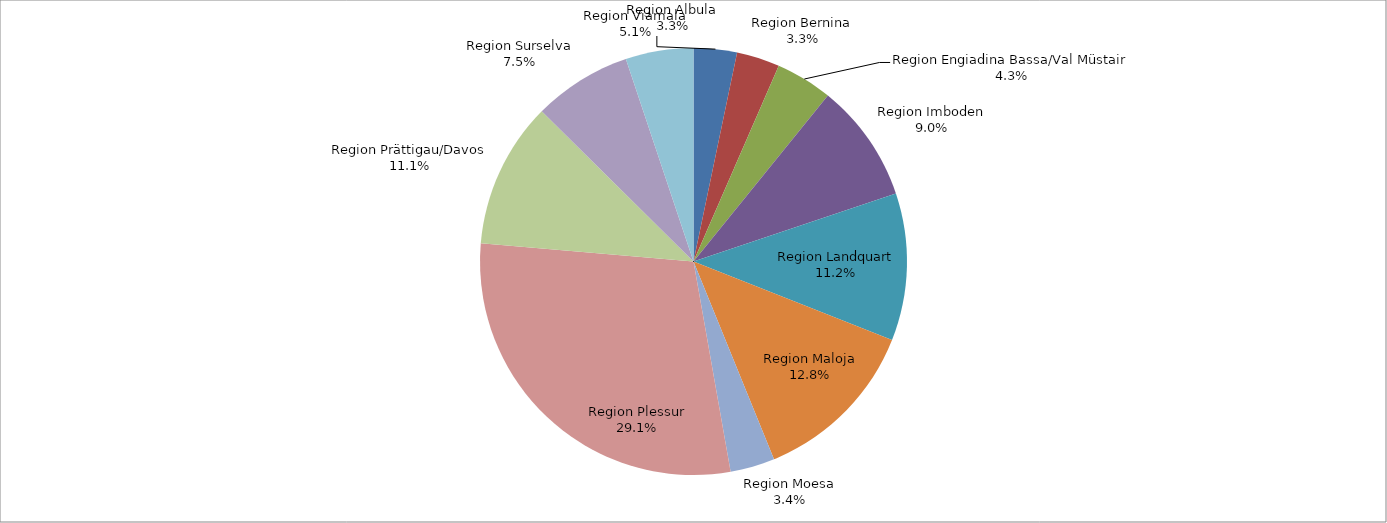
| Category | 2020 |
|---|---|
| Region Albula | 475507959.515 |
| Region Bernina | 473758247.251 |
| Region Engiadina Bassa/Val Müstair | 624205622.043 |
| Region Imboden | 1307412842.225 |
| Region Landquart | 1619890330.18 |
| Region Maloja | 1865204172.29 |
| Region Moesa | 489506449.828 |
| Region Plessur | 4229973804.159 |
| Region Prättigau/Davos | 1605828088.586 |
| Region Surselva | 1082699306.466 |
| Region Viamala | 744708987.247 |